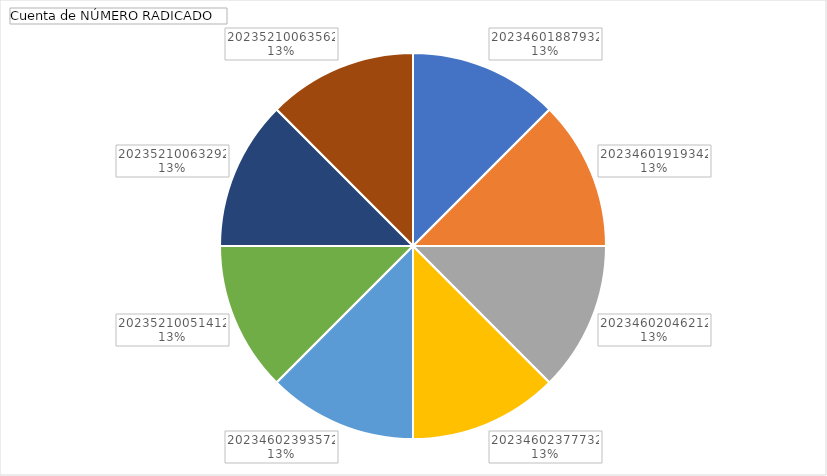
| Category | Total |
|---|---|
| 20234601887932 | 1 |
| 20234601919342 | 1 |
| 20234602046212 | 1 |
| 20234602377732 | 1 |
| 20234602393572 | 1 |
| 20235210051412 | 1 |
| 20235210063292 | 1 |
| 20235210063562 | 1 |